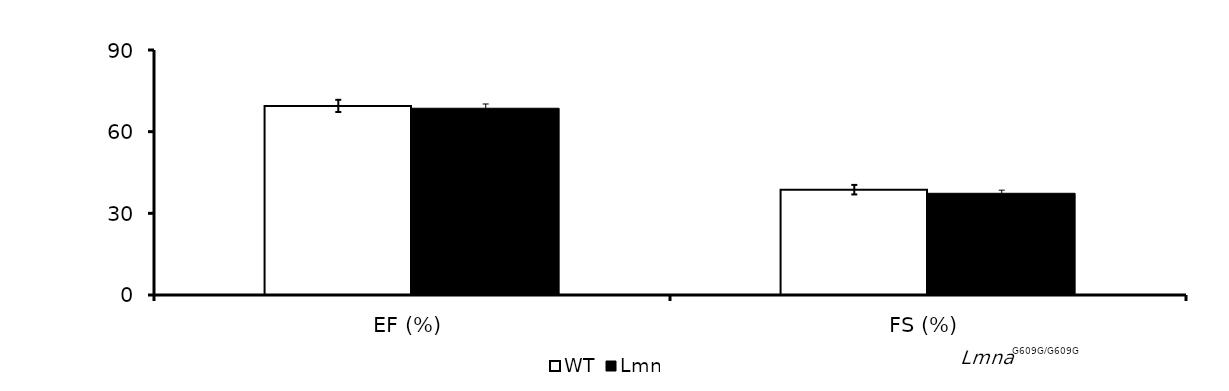
| Category | WT | Lmna |
|---|---|---|
| EF (%) | 69.461 | 68.606 |
| FS (%) | 38.694 | 37.365 |